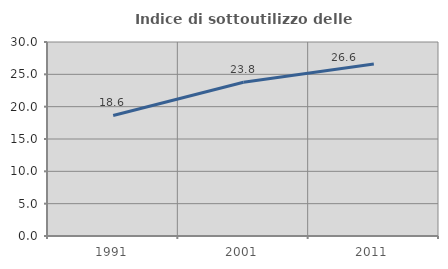
| Category | Indice di sottoutilizzo delle abitazioni  |
|---|---|
| 1991.0 | 18.646 |
| 2001.0 | 23.764 |
| 2011.0 | 26.585 |